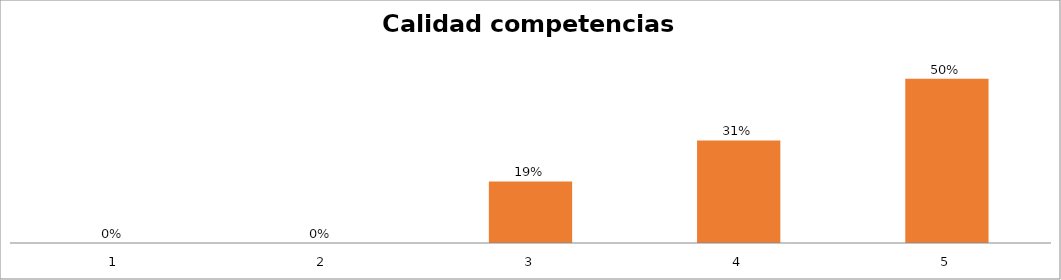
| Category | Series 1 |
|---|---|
| 0 | 0 |
| 1 | 0 |
| 2 | 0.188 |
| 3 | 0.312 |
| 4 | 0.5 |